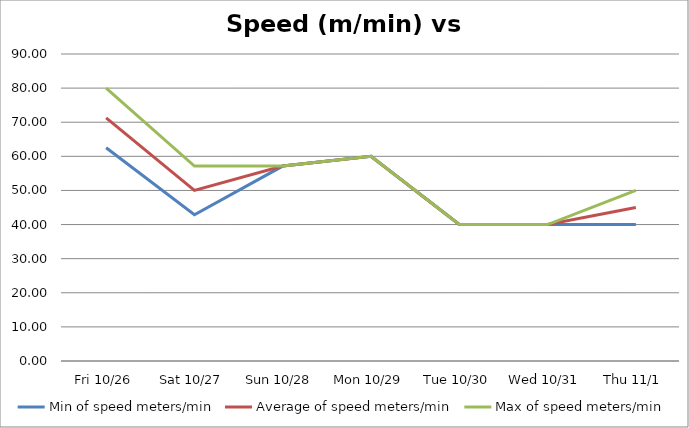
| Category | Min of speed meters/min | Average of speed meters/min | Max of speed meters/min |
|---|---|---|---|
| Fri 10/26 | 62.5 | 71.25 | 80 |
| Sat 10/27 | 42.857 | 50 | 57.143 |
| Sun 10/28 | 57.143 | 57.143 | 57.143 |
| Mon 10/29 | 60 | 60 | 60 |
| Tue 10/30 | 40 | 40 | 40 |
| Wed 10/31 | 40 | 40 | 40 |
| Thu 11/1 | 40 | 45 | 50 |